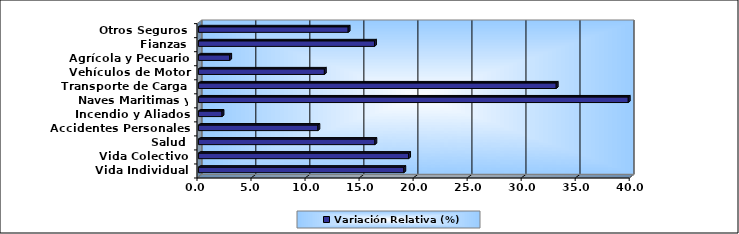
| Category | Variación Relativa (%) |
|---|---|
| Vida Individual | 19.008 |
| Vida Colectivo | 19.452 |
| Salud | 16.33 |
| Accidentes Personales | 11.057 |
| Incendio y Aliados | 2.184 |
| Naves Maritimas y Aéreas | 39.778 |
| Transporte de Carga | 33.111 |
| Vehículos de Motor | 11.656 |
| Agrícola y Pecuario | 2.896 |
| Fianzas | 16.296 |
| Otros Seguros | 13.859 |